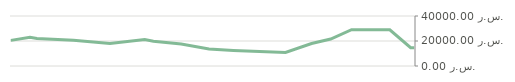
| Category | شهري  |
|---|---|
| 2013-04-23 | 14600 |
| 2013-04-25 | 14600 |
| 2013-05-07 | 29000 |
| 2013-05-14 | 29000 |
| 2013-05-14 | 29000 |
| 2013-05-29 | 29000 |
| 2013-06-10 | 21600 |
| 2013-06-21 | 17950 |
| 2013-07-06 | 10776.471 |
| 2013-08-05 | 12455.862 |
| 2013-08-19 | 13667.568 |
| 2013-09-04 | 17651.667 |
| 2013-09-20 | 19877.912 |
| 2013-09-25 | 21138.05 |
| 2013-10-15 | 17951.744 |
| 2013-11-05 | 20556.13 |
| 2013-11-26 | 21997.139 |
| 2013-11-30 | 22917.635 |
| 2013-12-11 | 20504.315 |